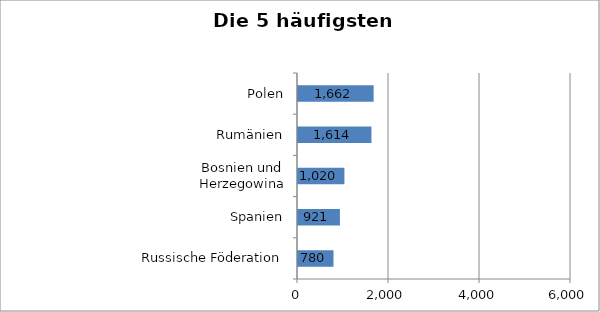
| Category | Series 0 |
|---|---|
| Russische Föderation | 780 |
| Spanien | 921 |
| Bosnien und Herzegowina | 1020 |
| Rumänien | 1614 |
| Polen | 1662 |